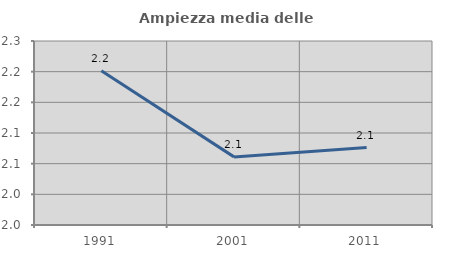
| Category | Ampiezza media delle famiglie |
|---|---|
| 1991.0 | 2.202 |
| 2001.0 | 2.061 |
| 2011.0 | 2.076 |